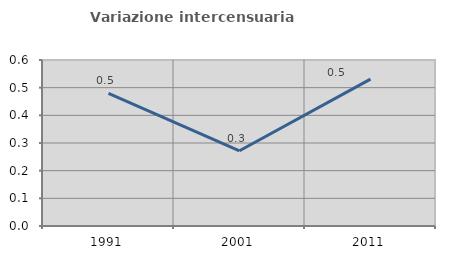
| Category | Variazione intercensuaria annua |
|---|---|
| 1991.0 | 0.479 |
| 2001.0 | 0.272 |
| 2011.0 | 0.531 |